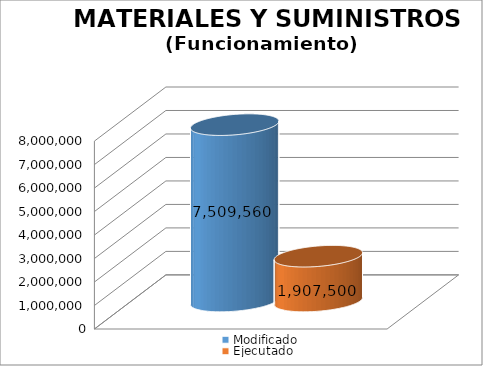
| Category | Modificado | Ejecutado |
|---|---|---|
| 0 | 7509560 | 1907499.97 |